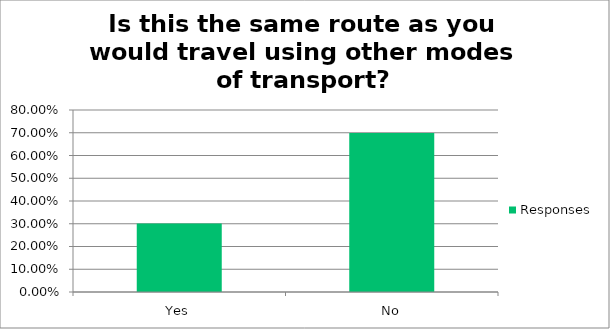
| Category | Responses |
|---|---|
| Yes | 0.301 |
| No | 0.699 |